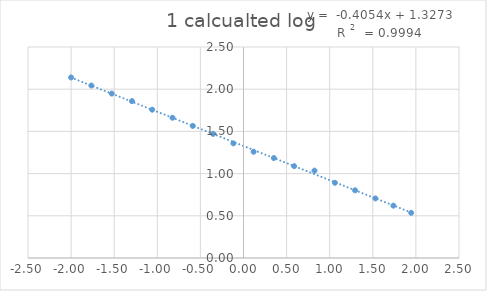
| Category | Series 0 |
|---|---|
| -2.0 | 2.139 |
| -1.764471553092451 | 2.044 |
| -1.5287082889410615 | 1.948 |
| -1.2941362877160807 | 1.859 |
| -1.0589857562944303 | 1.757 |
| -0.8239087409443188 | 1.662 |
| -0.5883802940367698 | 1.565 |
| -0.3526170298853802 | 1.47 |
| -0.11747546204511952 | 1.358 |
| 0.11727129565576427 | 1.259 |
| 0.3521825181113625 | 1.184 |
| 0.5877109650189114 | 1.088 |
| 0.8234742291703011 | 1.035 |
| 1.0606978403536116 | 0.891 |
| 1.294466226161593 | 0.802 |
| 1.530199698203082 | 0.706 |
| 1.7387805584843692 | 0.62 |
| 1.944975908412048 | 0.535 |